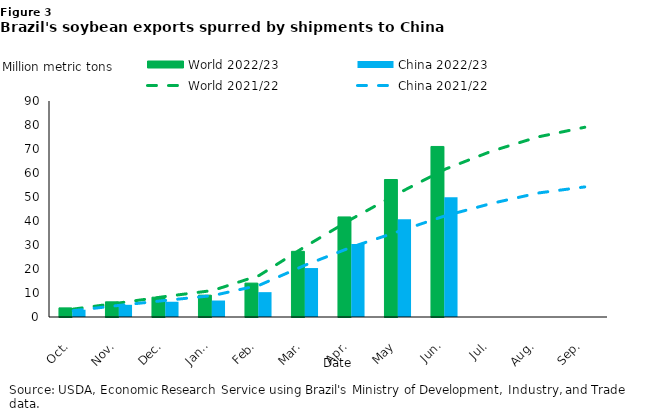
| Category | World 2022/23 | China 2022/23 |
|---|---|---|
| Oct. | 3.798 | 3.028 |
| Nov. | 6.323 | 5.077 |
| Dec. | 8.259 | 6.357 |
| Jan.. | 9.099 | 6.867 |
| Feb. | 14.122 | 10.356 |
| Mar. | 27.363 | 20.398 |
| Apr. | 41.699 | 30.455 |
| May | 57.285 | 40.717 |
| Jun. | 71.058 | 49.906 |
| Jul. | 0 | 0 |
| Aug. | 0 | 0 |
| Sep. | 0 | 0 |